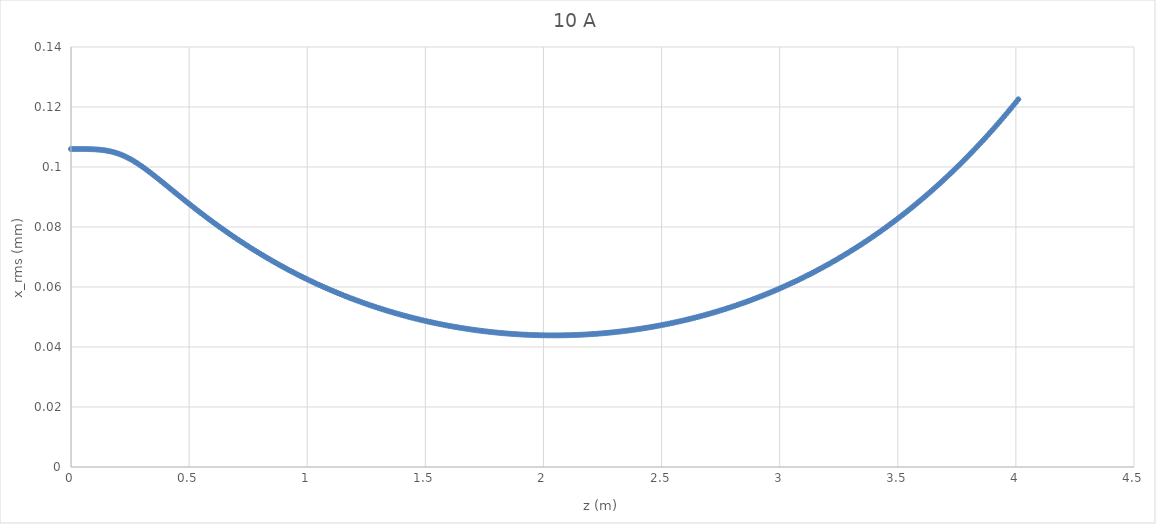
| Category | Series 0 |
|---|---|
| 0.0 | 0.106 |
| 0.01 | 0.106 |
| 0.02 | 0.106 |
| 0.03 | 0.106 |
| 0.04 | 0.106 |
| 0.05 | 0.106 |
| 0.06 | 0.106 |
| 0.07 | 0.106 |
| 0.08 | 0.106 |
| 0.09 | 0.106 |
| 0.1 | 0.106 |
| 0.11 | 0.106 |
| 0.12 | 0.106 |
| 0.13 | 0.106 |
| 0.14 | 0.106 |
| 0.15 | 0.105 |
| 0.16 | 0.105 |
| 0.17 | 0.105 |
| 0.18 | 0.105 |
| 0.19 | 0.105 |
| 0.2 | 0.104 |
| 0.21 | 0.104 |
| 0.22 | 0.104 |
| 0.23 | 0.103 |
| 0.24 | 0.103 |
| 0.25 | 0.103 |
| 0.26 | 0.102 |
| 0.27 | 0.102 |
| 0.28 | 0.101 |
| 0.29 | 0.101 |
| 0.3 | 0.1 |
| 0.31 | 0.1 |
| 0.32 | 0.099 |
| 0.33 | 0.098 |
| 0.34 | 0.098 |
| 0.35 | 0.097 |
| 0.36 | 0.097 |
| 0.37 | 0.096 |
| 0.38 | 0.095 |
| 0.39 | 0.095 |
| 0.4 | 0.094 |
| 0.41 | 0.093 |
| 0.42 | 0.093 |
| 0.43 | 0.092 |
| 0.44 | 0.092 |
| 0.45 | 0.091 |
| 0.46 | 0.09 |
| 0.47 | 0.09 |
| 0.48 | 0.089 |
| 0.49 | 0.088 |
| 0.5 | 0.088 |
| 0.51 | 0.087 |
| 0.52 | 0.086 |
| 0.53 | 0.086 |
| 0.54 | 0.085 |
| 0.55 | 0.085 |
| 0.56 | 0.084 |
| 0.57 | 0.083 |
| 0.58 | 0.083 |
| 0.59 | 0.082 |
| 0.6 | 0.082 |
| 0.61 | 0.081 |
| 0.62 | 0.081 |
| 0.63 | 0.08 |
| 0.64 | 0.079 |
| 0.65 | 0.079 |
| 0.66 | 0.078 |
| 0.67 | 0.078 |
| 0.68 | 0.077 |
| 0.69 | 0.077 |
| 0.7 | 0.076 |
| 0.71 | 0.076 |
| 0.72 | 0.075 |
| 0.73 | 0.075 |
| 0.74 | 0.074 |
| 0.75 | 0.074 |
| 0.76 | 0.073 |
| 0.77 | 0.073 |
| 0.78 | 0.072 |
| 0.79 | 0.072 |
| 0.8 | 0.071 |
| 0.81 | 0.071 |
| 0.82 | 0.07 |
| 0.83 | 0.07 |
| 0.84 | 0.069 |
| 0.85 | 0.069 |
| 0.86 | 0.068 |
| 0.87 | 0.068 |
| 0.88 | 0.067 |
| 0.89 | 0.067 |
| 0.9 | 0.067 |
| 0.91 | 0.066 |
| 0.92 | 0.066 |
| 0.93 | 0.065 |
| 0.94 | 0.065 |
| 0.95 | 0.065 |
| 0.96 | 0.064 |
| 0.97 | 0.064 |
| 0.98 | 0.063 |
| 0.99 | 0.063 |
| 1.0 | 0.063 |
| 1.01 | 0.062 |
| 1.02 | 0.062 |
| 1.03 | 0.061 |
| 1.04 | 0.061 |
| 1.05 | 0.061 |
| 1.06 | 0.06 |
| 1.07 | 0.06 |
| 1.08 | 0.06 |
| 1.09 | 0.059 |
| 1.1 | 0.059 |
| 1.11 | 0.059 |
| 1.12 | 0.058 |
| 1.13 | 0.058 |
| 1.14 | 0.058 |
| 1.15 | 0.057 |
| 1.16 | 0.057 |
| 1.17 | 0.057 |
| 1.18 | 0.056 |
| 1.19 | 0.056 |
| 1.2 | 0.056 |
| 1.21 | 0.056 |
| 1.22 | 0.055 |
| 1.23 | 0.055 |
| 1.24 | 0.055 |
| 1.25 | 0.054 |
| 1.26 | 0.054 |
| 1.27 | 0.054 |
| 1.28 | 0.054 |
| 1.29 | 0.053 |
| 1.3 | 0.053 |
| 1.31 | 0.053 |
| 1.32 | 0.053 |
| 1.33 | 0.052 |
| 1.34 | 0.052 |
| 1.35 | 0.052 |
| 1.36 | 0.052 |
| 1.37 | 0.051 |
| 1.38 | 0.051 |
| 1.39 | 0.051 |
| 1.4 | 0.051 |
| 1.41 | 0.05 |
| 1.42 | 0.05 |
| 1.43 | 0.05 |
| 1.44 | 0.05 |
| 1.45 | 0.05 |
| 1.46 | 0.049 |
| 1.47 | 0.049 |
| 1.48 | 0.049 |
| 1.49 | 0.049 |
| 1.5 | 0.049 |
| 1.51 | 0.049 |
| 1.52 | 0.048 |
| 1.53 | 0.048 |
| 1.54 | 0.048 |
| 1.55 | 0.048 |
| 1.56 | 0.048 |
| 1.57 | 0.048 |
| 1.58 | 0.047 |
| 1.59 | 0.047 |
| 1.6 | 0.047 |
| 1.61 | 0.047 |
| 1.62 | 0.047 |
| 1.63 | 0.047 |
| 1.64 | 0.047 |
| 1.65 | 0.046 |
| 1.66 | 0.046 |
| 1.67 | 0.046 |
| 1.68 | 0.046 |
| 1.69 | 0.046 |
| 1.7 | 0.046 |
| 1.71 | 0.046 |
| 1.72 | 0.046 |
| 1.73 | 0.045 |
| 1.74 | 0.045 |
| 1.75 | 0.045 |
| 1.76 | 0.045 |
| 1.77 | 0.045 |
| 1.78 | 0.045 |
| 1.79 | 0.045 |
| 1.8 | 0.045 |
| 1.81 | 0.045 |
| 1.82 | 0.045 |
| 1.83 | 0.045 |
| 1.84 | 0.045 |
| 1.85 | 0.044 |
| 1.86 | 0.044 |
| 1.87 | 0.044 |
| 1.88 | 0.044 |
| 1.89 | 0.044 |
| 1.9 | 0.044 |
| 1.91 | 0.044 |
| 1.92 | 0.044 |
| 1.93 | 0.044 |
| 1.94 | 0.044 |
| 1.95 | 0.044 |
| 1.96 | 0.044 |
| 1.97 | 0.044 |
| 1.98 | 0.044 |
| 1.99 | 0.044 |
| 2.0 | 0.044 |
| 2.01 | 0.044 |
| 2.02 | 0.044 |
| 2.03 | 0.044 |
| 2.04 | 0.044 |
| 2.05 | 0.044 |
| 2.06 | 0.044 |
| 2.07 | 0.044 |
| 2.08 | 0.044 |
| 2.09 | 0.044 |
| 2.1 | 0.044 |
| 2.11 | 0.044 |
| 2.12 | 0.044 |
| 2.13 | 0.044 |
| 2.14 | 0.044 |
| 2.15 | 0.044 |
| 2.16 | 0.044 |
| 2.17 | 0.044 |
| 2.18 | 0.044 |
| 2.19 | 0.044 |
| 2.2 | 0.044 |
| 2.21 | 0.044 |
| 2.22 | 0.044 |
| 2.23 | 0.044 |
| 2.24 | 0.045 |
| 2.25 | 0.045 |
| 2.26 | 0.045 |
| 2.27 | 0.045 |
| 2.28 | 0.045 |
| 2.29 | 0.045 |
| 2.3 | 0.045 |
| 2.31 | 0.045 |
| 2.32 | 0.045 |
| 2.33 | 0.045 |
| 2.34 | 0.045 |
| 2.35 | 0.045 |
| 2.36 | 0.046 |
| 2.37 | 0.046 |
| 2.38 | 0.046 |
| 2.39 | 0.046 |
| 2.4 | 0.046 |
| 2.41 | 0.046 |
| 2.42 | 0.046 |
| 2.43 | 0.046 |
| 2.44 | 0.046 |
| 2.45 | 0.047 |
| 2.46 | 0.047 |
| 2.47 | 0.047 |
| 2.48 | 0.047 |
| 2.49 | 0.047 |
| 2.5 | 0.047 |
| 2.51 | 0.047 |
| 2.52 | 0.048 |
| 2.53 | 0.048 |
| 2.54 | 0.048 |
| 2.55 | 0.048 |
| 2.56 | 0.048 |
| 2.57 | 0.048 |
| 2.58 | 0.049 |
| 2.59 | 0.049 |
| 2.6 | 0.049 |
| 2.61 | 0.049 |
| 2.62 | 0.049 |
| 2.63 | 0.05 |
| 2.64 | 0.05 |
| 2.65 | 0.05 |
| 2.66 | 0.05 |
| 2.67 | 0.05 |
| 2.68 | 0.051 |
| 2.69 | 0.051 |
| 2.7 | 0.051 |
| 2.71 | 0.051 |
| 2.72 | 0.051 |
| 2.73 | 0.052 |
| 2.74 | 0.052 |
| 2.75 | 0.052 |
| 2.76 | 0.052 |
| 2.77 | 0.053 |
| 2.78 | 0.053 |
| 2.79 | 0.053 |
| 2.8 | 0.053 |
| 2.81 | 0.054 |
| 2.82 | 0.054 |
| 2.83 | 0.054 |
| 2.84 | 0.055 |
| 2.85 | 0.055 |
| 2.86 | 0.055 |
| 2.87 | 0.055 |
| 2.88 | 0.056 |
| 2.89 | 0.056 |
| 2.9 | 0.056 |
| 2.91 | 0.057 |
| 2.92 | 0.057 |
| 2.93 | 0.057 |
| 2.94 | 0.058 |
| 2.95 | 0.058 |
| 2.96 | 0.058 |
| 2.97 | 0.058 |
| 2.98 | 0.059 |
| 2.99 | 0.059 |
| 3.0 | 0.059 |
| 3.01 | 0.06 |
| 3.02 | 0.06 |
| 3.03 | 0.061 |
| 3.04 | 0.061 |
| 3.05 | 0.061 |
| 3.06 | 0.062 |
| 3.07 | 0.062 |
| 3.08 | 0.062 |
| 3.09 | 0.063 |
| 3.1 | 0.063 |
| 3.11 | 0.064 |
| 3.12 | 0.064 |
| 3.13 | 0.064 |
| 3.14 | 0.065 |
| 3.15 | 0.065 |
| 3.16 | 0.066 |
| 3.17 | 0.066 |
| 3.18 | 0.066 |
| 3.19 | 0.067 |
| 3.2 | 0.067 |
| 3.21 | 0.068 |
| 3.22 | 0.068 |
| 3.23 | 0.069 |
| 3.24 | 0.069 |
| 3.25 | 0.07 |
| 3.26 | 0.07 |
| 3.27 | 0.07 |
| 3.28 | 0.071 |
| 3.29 | 0.071 |
| 3.3 | 0.072 |
| 3.31 | 0.072 |
| 3.32 | 0.073 |
| 3.33 | 0.073 |
| 3.34 | 0.074 |
| 3.35 | 0.074 |
| 3.36 | 0.075 |
| 3.37 | 0.075 |
| 3.38 | 0.076 |
| 3.39 | 0.077 |
| 3.4 | 0.077 |
| 3.41 | 0.078 |
| 3.42 | 0.078 |
| 3.43 | 0.079 |
| 3.44 | 0.079 |
| 3.45 | 0.08 |
| 3.46 | 0.08 |
| 3.47 | 0.081 |
| 3.48 | 0.082 |
| 3.49 | 0.082 |
| 3.5 | 0.083 |
| 3.51 | 0.083 |
| 3.52 | 0.084 |
| 3.53 | 0.085 |
| 3.54 | 0.085 |
| 3.55 | 0.086 |
| 3.56 | 0.087 |
| 3.57 | 0.087 |
| 3.58 | 0.088 |
| 3.59 | 0.088 |
| 3.6 | 0.089 |
| 3.61 | 0.09 |
| 3.62 | 0.09 |
| 3.63 | 0.091 |
| 3.64 | 0.092 |
| 3.65 | 0.093 |
| 3.66 | 0.093 |
| 3.67 | 0.094 |
| 3.68 | 0.095 |
| 3.69 | 0.095 |
| 3.7 | 0.096 |
| 3.71 | 0.097 |
| 3.72 | 0.098 |
| 3.73 | 0.098 |
| 3.74 | 0.099 |
| 3.75 | 0.1 |
| 3.76 | 0.101 |
| 3.77 | 0.101 |
| 3.78 | 0.102 |
| 3.79 | 0.103 |
| 3.8 | 0.104 |
| 3.81 | 0.105 |
| 3.82 | 0.105 |
| 3.83 | 0.106 |
| 3.84 | 0.107 |
| 3.85 | 0.108 |
| 3.86 | 0.109 |
| 3.87 | 0.11 |
| 3.88 | 0.111 |
| 3.89 | 0.111 |
| 3.9 | 0.112 |
| 3.91 | 0.113 |
| 3.92 | 0.114 |
| 3.93 | 0.115 |
| 3.94 | 0.116 |
| 3.95 | 0.117 |
| 3.96 | 0.118 |
| 3.97 | 0.119 |
| 3.98 | 0.12 |
| 3.99 | 0.121 |
| 4.0 | 0.122 |
| 4.01 | 0.123 |